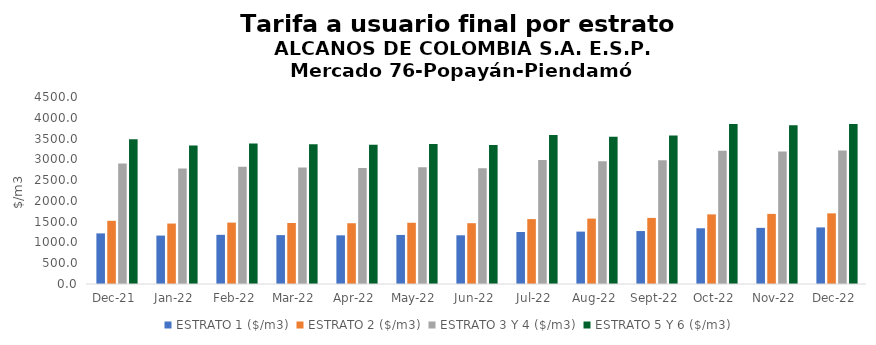
| Category | ESTRATO 1 ($/m3) | ESTRATO 2 ($/m3) | ESTRATO 3 Y 4 ($/m3) | ESTRATO 5 Y 6 ($/m3) |
|---|---|---|---|---|
| 2021-12-01 | 1217.71 | 1520.34 | 2902.39 | 3482.868 |
| 2022-01-01 | 1165.24 | 1454.81 | 2778.76 | 3334.512 |
| 2022-02-01 | 1183.47 | 1477.36 | 2818.77 | 3382.524 |
| 2022-03-01 | 1176.21 | 1468.38 | 2801.57 | 3361.884 |
| 2022-04-01 | 1171.36 | 1462.31 | 2791.83 | 3350.196 |
| 2022-05-01 | 1180.61 | 1473.74 | 2808.77 | 3370.524 |
| 2022-06-01 | 1172.01 | 1463.23 | 2787.21 | 3344.652 |
| 2022-07-01 | 1250.9 | 1561.56 | 2986.65 | 3583.98 |
| 2022-08-01 | 1261.02 | 1574.02 | 2951.9 | 3542.28 |
| 2022-09-01 | 1273.99 | 1590.22 | 2979.32 | 3575.184 |
| 2022-10-01 | 1341.42 | 1674.98 | 3208.12 | 3849.744 |
| 2022-11-01 | 1350.95 | 1687.14 | 3185.9 | 3823.08 |
| 2022-12-01 | 1361.48 | 1700.11 | 3209.93 | 3851.916 |